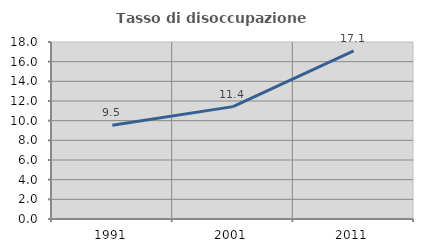
| Category | Tasso di disoccupazione giovanile  |
|---|---|
| 1991.0 | 9.524 |
| 2001.0 | 11.429 |
| 2011.0 | 17.105 |